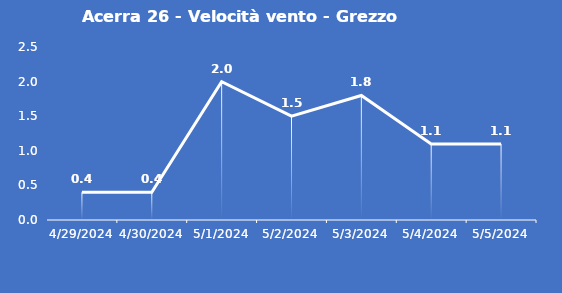
| Category | Acerra 26 - Velocità vento - Grezzo (m/s) |
|---|---|
| 4/29/24 | 0.4 |
| 4/30/24 | 0.4 |
| 5/1/24 | 2 |
| 5/2/24 | 1.5 |
| 5/3/24 | 1.8 |
| 5/4/24 | 1.1 |
| 5/5/24 | 1.1 |